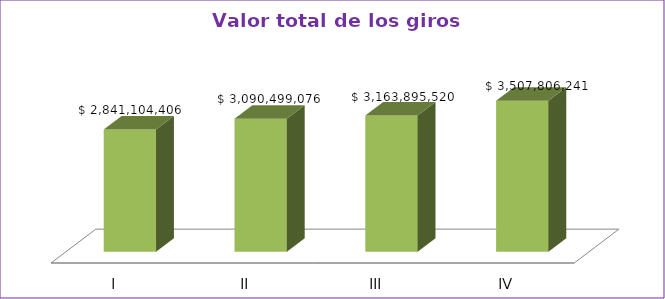
| Category | Series 0 |
|---|---|
| I | 2841104406 |
| II | 3090499076 |
| III | 3163895520 |
| IV | 3507806241 |